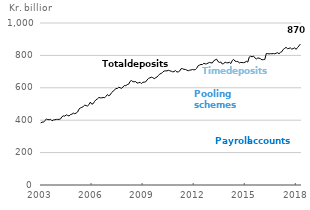
| Category | Total deposits |
|---|---|
| 2003-01-01 | 383.163 |
| 2003-02-01 | 388.506 |
| 2003-03-01 | 387.365 |
| 2003-04-01 | 398.59 |
| 2003-05-01 | 406.551 |
| 2003-06-01 | 403.833 |
| 2003-07-01 | 402.896 |
| 2003-08-01 | 405.29 |
| 2003-09-01 | 396.325 |
| 2003-10-01 | 401.767 |
| 2003-11-01 | 402.512 |
| 2003-12-01 | 405.277 |
| 2004-01-01 | 404.851 |
| 2004-02-01 | 405.009 |
| 2004-03-01 | 408.014 |
| 2004-04-01 | 421.731 |
| 2004-05-01 | 426.799 |
| 2004-06-01 | 424.861 |
| 2004-07-01 | 433.108 |
| 2004-08-01 | 429.45 |
| 2004-09-01 | 425.836 |
| 2004-10-01 | 435.016 |
| 2004-11-01 | 436.869 |
| 2004-12-01 | 443.906 |
| 2005-01-01 | 439.732 |
| 2005-02-01 | 444.19 |
| 2005-03-01 | 450.466 |
| 2005-04-01 | 468.518 |
| 2005-05-01 | 475.492 |
| 2005-06-01 | 479.546 |
| 2005-07-01 | 483.897 |
| 2005-08-01 | 492.578 |
| 2005-09-01 | 490.411 |
| 2005-10-01 | 487.714 |
| 2005-11-01 | 496.153 |
| 2005-12-01 | 511.473 |
| 2006-01-01 | 499.087 |
| 2006-02-01 | 502.106 |
| 2006-03-01 | 516.589 |
| 2006-04-01 | 526.139 |
| 2006-05-01 | 531.665 |
| 2006-06-01 | 540.335 |
| 2006-07-01 | 537.868 |
| 2006-08-01 | 538.144 |
| 2006-09-01 | 540.458 |
| 2006-10-01 | 538.219 |
| 2006-11-01 | 547.344 |
| 2006-12-01 | 557.95 |
| 2007-01-01 | 551.013 |
| 2007-02-01 | 556.603 |
| 2007-03-01 | 570.574 |
| 2007-04-01 | 578.852 |
| 2007-05-01 | 585.185 |
| 2007-06-01 | 595.973 |
| 2007-07-01 | 595.656 |
| 2007-08-01 | 603.703 |
| 2007-09-01 | 600.2 |
| 2007-10-01 | 596.738 |
| 2007-11-01 | 604.843 |
| 2007-12-01 | 614.557 |
| 2008-01-01 | 613.221 |
| 2008-02-01 | 619.636 |
| 2008-03-01 | 622.576 |
| 2008-04-01 | 639.312 |
| 2008-05-01 | 645.201 |
| 2008-06-01 | 637.515 |
| 2008-07-01 | 637.699 |
| 2008-08-01 | 638.148 |
| 2008-09-01 | 628.825 |
| 2008-10-01 | 630.979 |
| 2008-11-01 | 634.441 |
| 2008-12-01 | 625.761 |
| 2009-01-01 | 634.174 |
| 2009-02-01 | 634.836 |
| 2009-03-01 | 636.996 |
| 2009-04-01 | 648.305 |
| 2009-05-01 | 657.955 |
| 2009-06-01 | 661.849 |
| 2009-07-01 | 665.492 |
| 2009-08-01 | 662.8 |
| 2009-09-01 | 656.448 |
| 2009-10-01 | 661.746 |
| 2009-11-01 | 666.802 |
| 2009-12-01 | 676.609 |
| 2010-01-01 | 685.081 |
| 2010-02-01 | 689.067 |
| 2010-03-01 | 695.629 |
| 2010-04-01 | 704.107 |
| 2010-05-01 | 704.309 |
| 2010-06-01 | 704.554 |
| 2010-07-01 | 707.92 |
| 2010-08-01 | 705.192 |
| 2010-09-01 | 702.586 |
| 2010-10-01 | 698.634 |
| 2010-11-01 | 699.949 |
| 2010-12-01 | 706.446 |
| 2011-01-01 | 697.738 |
| 2011-02-01 | 698.291 |
| 2011-03-01 | 703.428 |
| 2011-04-01 | 718.442 |
| 2011-05-01 | 717.864 |
| 2011-06-01 | 713.649 |
| 2011-07-01 | 713.577 |
| 2011-08-01 | 709.277 |
| 2011-09-01 | 705.207 |
| 2011-10-01 | 708.522 |
| 2011-11-01 | 710.069 |
| 2011-12-01 | 712.938 |
| 2012-01-01 | 710.921 |
| 2012-02-01 | 712.262 |
| 2012-03-01 | 720.89 |
| 2012-04-01 | 736.128 |
| 2012-05-01 | 740.338 |
| 2012-06-01 | 744.281 |
| 2012-07-01 | 743.412 |
| 2012-08-01 | 751.278 |
| 2012-09-01 | 747.337 |
| 2012-10-01 | 748.26 |
| 2012-11-01 | 752.645 |
| 2012-12-01 | 756.631 |
| 2013-01-01 | 754.175 |
| 2013-02-01 | 753.612 |
| 2013-03-01 | 766.759 |
| 2013-04-01 | 772.287 |
| 2013-05-01 | 776.987 |
| 2013-06-01 | 761.967 |
| 2013-07-01 | 757.025 |
| 2013-08-01 | 759.084 |
| 2013-09-01 | 746.906 |
| 2013-10-01 | 749.784 |
| 2013-11-01 | 758.137 |
| 2013-12-01 | 754.748 |
| 2014-01-01 | 754.058 |
| 2014-02-01 | 757.427 |
| 2014-03-01 | 749.632 |
| 2014-04-01 | 767.879 |
| 2014-05-01 | 775.294 |
| 2014-06-01 | 764.71 |
| 2014-07-01 | 761.932 |
| 2014-08-01 | 762.292 |
| 2014-09-01 | 753.785 |
| 2014-10-01 | 756.8 |
| 2014-11-01 | 756.062 |
| 2014-12-01 | 754.914 |
| 2015-01-01 | 757.554 |
| 2015-02-01 | 763.42 |
| 2015-03-01 | 758.682 |
| 2015-04-01 | 789.608 |
| 2015-05-01 | 795.003 |
| 2015-06-01 | 791.181 |
| 2015-07-01 | 795.595 |
| 2015-08-01 | 784.695 |
| 2015-09-01 | 778.043 |
| 2015-10-01 | 784.025 |
| 2015-11-01 | 782.778 |
| 2015-12-01 | 779.175 |
| 2016-01-01 | 772.662 |
| 2016-02-01 | 773.94 |
| 2016-03-01 | 775.461 |
| 2016-04-01 | 810.864 |
| 2016-05-01 | 811.04 |
| 2016-06-01 | 809.04 |
| 2016-07-01 | 811.086 |
| 2016-08-01 | 809.763 |
| 2016-09-01 | 811.663 |
| 2016-10-01 | 809.783 |
| 2016-11-01 | 813.894 |
| 2016-12-01 | 816.572 |
| 2017-01-01 | 810.159 |
| 2017-02-01 | 818.767 |
| 2017-03-01 | 822.75 |
| 2017-04-01 | 837.135 |
| 2017-05-01 | 843.604 |
| 2017-06-01 | 849.539 |
| 2017-07-01 | 841.57 |
| 2017-08-01 | 843.192 |
| 2017-09-01 | 846.381 |
| 2017-10-01 | 838.823 |
| 2017-11-01 | 841.765 |
| 2017-12-01 | 847.033 |
| 2018-01-01 | 837.189 |
| 2018-02-01 | 848.04 |
| 2018-03-01 | 858.142 |
| 2018-04-01 | 869.845 |